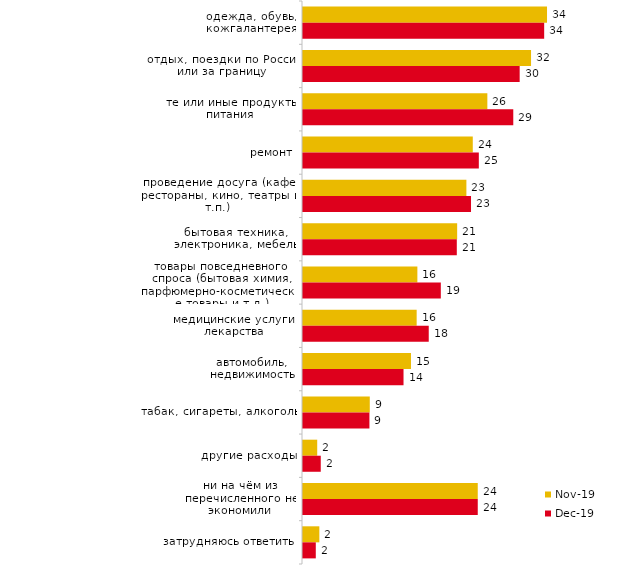
| Category | ноя.19 | дек.19 |
|---|---|---|
| одежда, обувь, кожгалантерея | 34.01 | 33.614 |
| отдых, поездки по России или за границу | 31.782 | 30.198 |
| те или иные продукты питания | 25.693 | 29.307 |
| ремонт | 23.663 | 24.505 |
| проведение досуга (кафе, рестораны, кино, театры и т.п.) | 22.772 | 23.416 |
| бытовая техника, электроника, мебель | 21.485 | 21.436 |
| товары повседневного спроса (бытовая химия, парфюмерно-косметические товары и т.д.) | 15.941 | 19.208 |
| медицинские услуги, лекарства | 15.842 | 17.525 |
| автомобиль, недвижимость | 15.05 | 14.01 |
| табак, сигареты, алкоголь | 9.307 | 9.257 |
| другие расходы | 1.98 | 2.475 |
| ни на чём из перечисленного не экономили | 24.356 | 24.356 |
| затрудняюсь ответить | 2.277 | 1.782 |